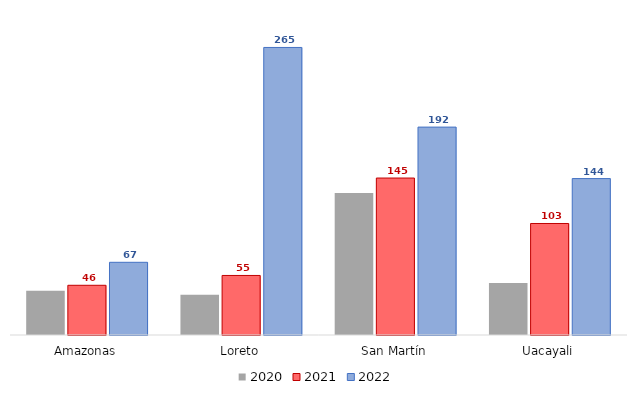
| Category | 2020 | 2021 | 2022 |
|---|---|---|---|
| Amazonas | 40.92 | 45.89 | 67.1 |
| Loreto | 37.12 | 54.96 | 265.42 |
| San Martín | 131.14 | 144.88 | 191.9 |
| Uacayali | 48.03 | 102.93 | 144.39 |